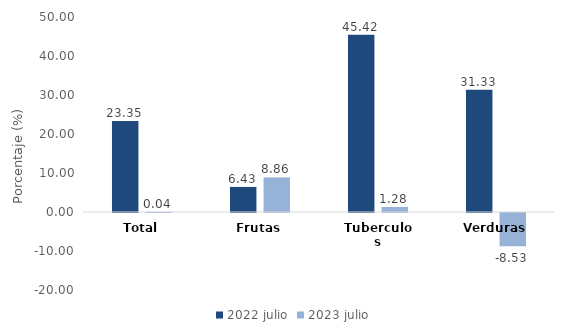
| Category | 2022 | 2023 |
|---|---|---|
| Total | 23.349 | 0.037 |
| Frutas | 6.426 | 8.865 |
| Tuberculos | 45.423 | 1.283 |
| Verduras | 31.333 | -8.533 |